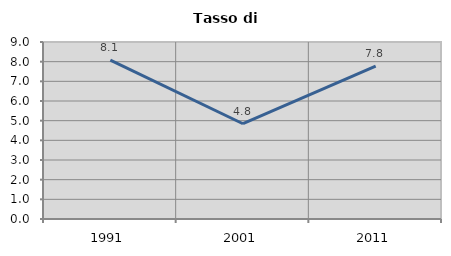
| Category | Tasso di disoccupazione   |
|---|---|
| 1991.0 | 8.076 |
| 2001.0 | 4.843 |
| 2011.0 | 7.779 |